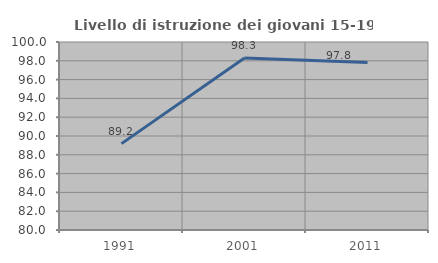
| Category | Livello di istruzione dei giovani 15-19 anni |
|---|---|
| 1991.0 | 89.189 |
| 2001.0 | 98.305 |
| 2011.0 | 97.826 |